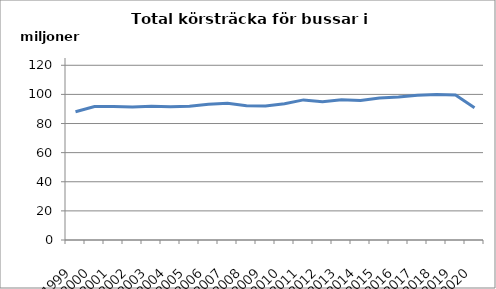
| Category | Series 0 |
|---|---|
| 1999.0 | 88068745.8 |
| 2000.0 | 91705466.2 |
| 2001.0 | 91658398.3 |
| 2002.0 | 91307116.6 |
| 2003.0 | 91810402.3 |
| 2004.0 | 91551523.5 |
| 2005.0 | 91821421.8 |
| 2006.0 | 93208075.7 |
| 2007.0 | 93942192.9 |
| 2008.0 | 92253430.3 |
| 2009.0 | 92055071.1 |
| 2010.0 | 93610479.4 |
| 2011.0 | 96220058.7 |
| 2012.0 | 94929589.9 |
| 2013.0 | 96275326 |
| 2014.0 | 95853494.1 |
| 2015.0 | 97499011.5 |
| 2016.0 | 98203637.1 |
| 2017.0 | 99463592.8 |
| 2018.0 | 99879373 |
| 2019.0 | 99613542 |
| 2020.0 | 90891250 |